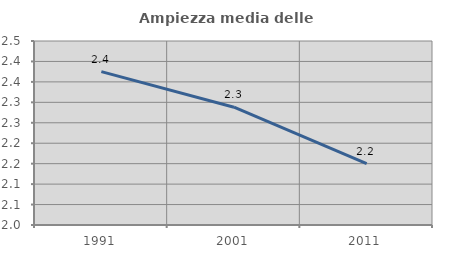
| Category | Ampiezza media delle famiglie |
|---|---|
| 1991.0 | 2.375 |
| 2001.0 | 2.288 |
| 2011.0 | 2.15 |